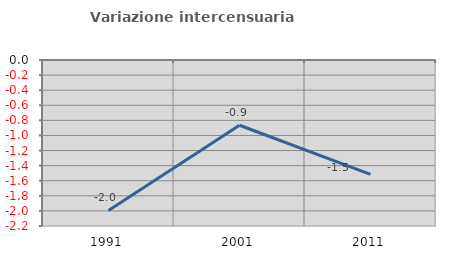
| Category | Variazione intercensuaria annua |
|---|---|
| 1991.0 | -1.994 |
| 2001.0 | -0.865 |
| 2011.0 | -1.515 |